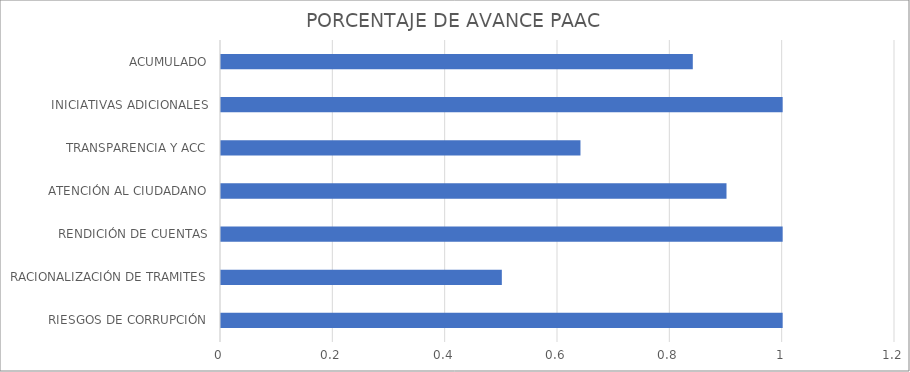
| Category | Series 0 |
|---|---|
| RIESGOS DE CORRUPCIÓN | 1 |
| RACIONALIZACIÓN DE TRAMITES | 0.5 |
| RENDICIÓN DE CUENTAS | 1 |
| ATENCIÓN AL CIUDADANO | 0.9 |
| TRANSPARENCIA Y ACC | 0.64 |
| INICIATIVAS ADICIONALES | 1 |
| ACUMULADO | 0.84 |